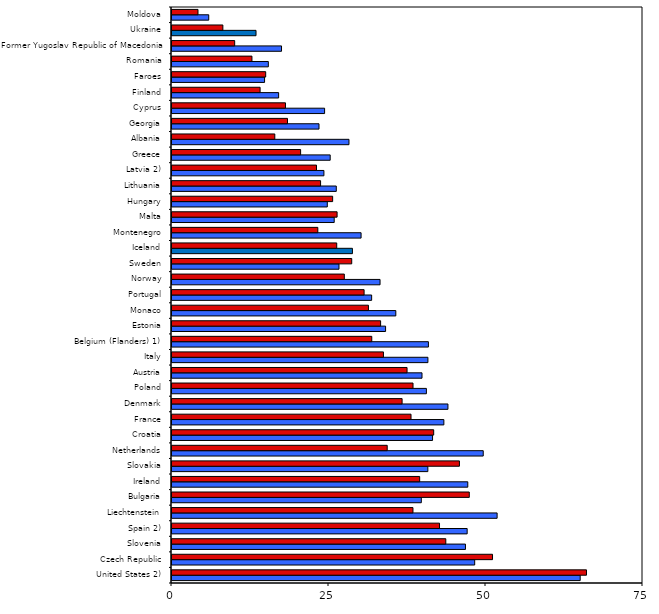
| Category | Boys | Girls |
|---|---|---|
| United States 2) | 65 | 66 |
| Czech Republic | 48.2 | 51.04 |
| Slovenia | 46.73 | 43.6 |
| Spain 2) | 47 | 42.6 |
| Liechtenstein | 51.77 | 38.37 |
| Bulgaria | 39.7 | 47.34 |
| Ireland | 47.1 | 39.44 |
| Slovakia | 40.74 | 45.77 |
| Netherlands | 49.56 | 34.27 |
| Croatia | 41.49 | 41.67 |
| France | 43.29 | 38.06 |
| Denmark | 43.94 | 36.64 |
| Poland | 40.51 | 38.38 |
| Austria | 39.81 | 37.43 |
| Italy | 40.75 | 33.67 |
| Belgium (Flanders) 1) | 40.83 | 31.81 |
| Estonia | 34.01 | 33.22 |
| Monaco | 35.64 | 31.28 |
| Portugal | 31.79 | 30.59 |
| Norway | 33.13 | 27.44 |
| Sweden | 26.59 | 28.62 |
| Iceland | 28.73 | 26.23 |
| Montenegro | 30.11 | 23.22 |
| Malta | 25.83 | 26.29 |
| Hungary | 24.73 | 25.58 |
| Lithuania | 26.16 | 23.66 |
| Latvia 2) | 24.19 | 23.01 |
| Greece | 25.19 | 20.48 |
| Albania | 28.18 | 16.37 |
| Georgia | 23.41 | 18.39 |
| Cyprus | 24.3 | 18.07 |
| Finland | 16.98 | 14.03 |
| Faroes | 14.74 | 14.92 |
| Romania | 15.34 | 12.73 |
| Former Yugoslav Republic of Macedonia | 17.44 | 9.98 |
| Ukraine | 13.38 | 8.1 |
| Moldova | 5.85 | 4.14 |